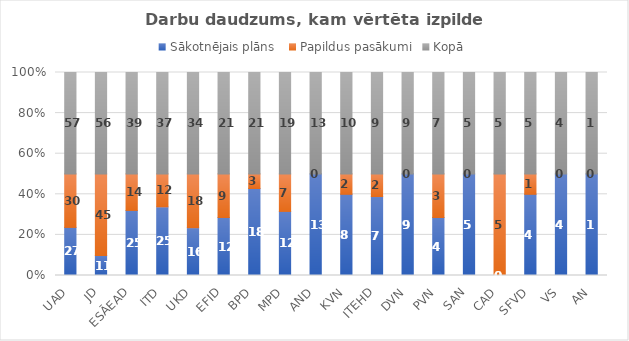
| Category | Sākotnējais plāns  | Papildus pasākumi | Kopā |
|---|---|---|---|
| UAD | 27 | 30 | 57 |
| JD | 11 | 45 | 56 |
| ESĀEAD | 25 | 14 | 39 |
| ITD | 25 | 12 | 37 |
| UKD | 16 | 18 | 34 |
| EFID | 12 | 9 | 21 |
| BPD | 18 | 3 | 21 |
| MPD | 12 | 7 | 19 |
| AND | 13 | 0 | 13 |
| KVN | 8 | 2 | 10 |
| ITEHD | 7 | 2 | 9 |
| DVN | 9 | 0 | 9 |
| PVN | 4 | 3 | 7 |
| SAN | 5 | 0 | 5 |
| CAD | 0 | 5 | 5 |
| SFVD | 4 | 1 | 5 |
| VS | 4 | 0 | 4 |
| AN | 1 | 0 | 1 |